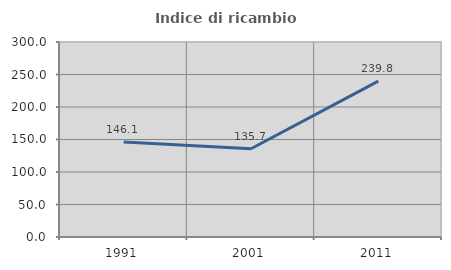
| Category | Indice di ricambio occupazionale  |
|---|---|
| 1991.0 | 146.078 |
| 2001.0 | 135.714 |
| 2011.0 | 239.844 |